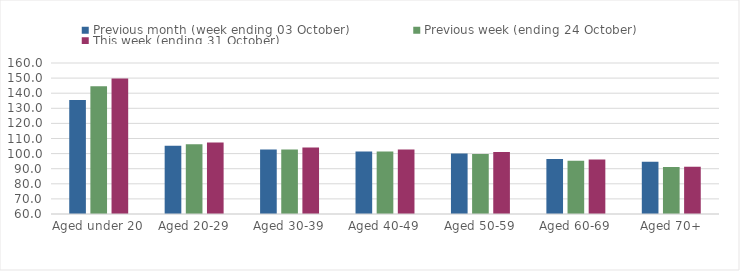
| Category | Previous month (week ending 03 October) | Previous week (ending 24 October) | This week (ending 31 October) |
|---|---|---|---|
| Aged under 20 | 135.53 | 144.52 | 149.72 |
| Aged 20-29 | 105.12 | 106.13 | 107.27 |
| Aged 30-39 | 102.73 | 102.66 | 104.01 |
| Aged 40-49 | 101.46 | 101.39 | 102.76 |
| Aged 50-59 | 100.12 | 99.76 | 101.09 |
| Aged 60-69 | 96.37 | 95.25 | 96.15 |
| Aged 70+ | 94.55 | 91.13 | 91.3 |